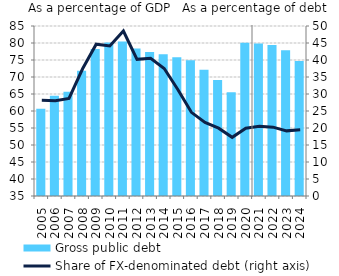
| Category | Gross public debt |
|---|---|
| 2005.0 | 60.642 |
| 2006.0 | 64.504 |
| 2007.0 | 65.654 |
| 2008.0 | 71.843 |
| 2009.0 | 78.217 |
| 2010.0 | 80.163 |
| 2011.0 | 80.442 |
| 2012.0 | 78.361 |
| 2013.0 | 77.354 |
| 2014.0 | 76.688 |
| 2015.0 | 75.821 |
| 2016.0 | 74.932 |
| 2017.0 | 72.163 |
| 2018.0 | 69.117 |
| 2019.0 | 65.488 |
| 2020.0 | 80.056 |
| 2021.0 | 79.842 |
| 2022.0 | 79.445 |
| 2023.0 | 77.856 |
| 2024.0 | 74.72 |